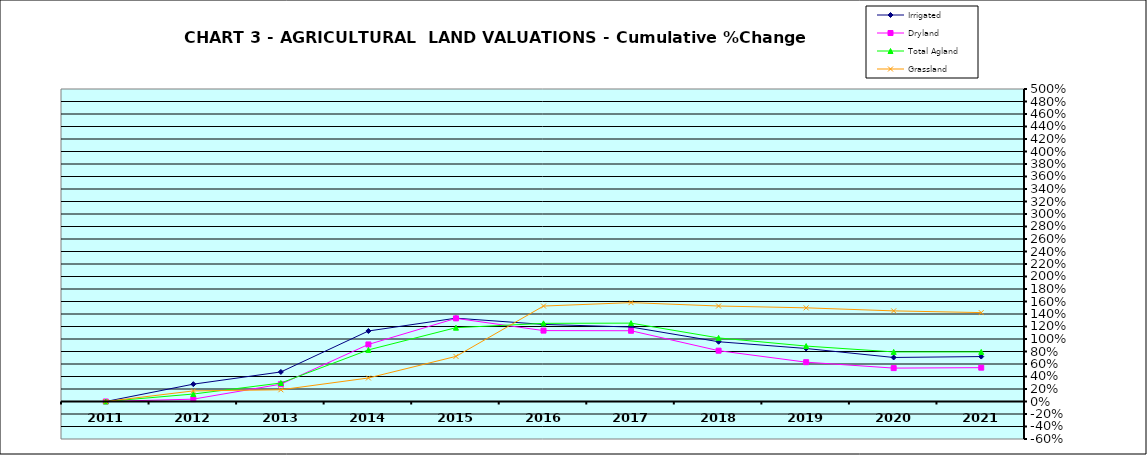
| Category | Irrigated | Dryland | Total Agland | Grassland |
|---|---|---|---|---|
| 2011.0 | 0 | 0 | 0 | 0 |
| 2012.0 | 0.277 | 0.038 | 0.12 | 0.17 |
| 2013.0 | 0.473 | 0.277 | 0.296 | 0.188 |
| 2014.0 | 1.128 | 0.913 | 0.826 | 0.376 |
| 2015.0 | 1.333 | 1.33 | 1.181 | 0.722 |
| 2016.0 | 1.233 | 1.134 | 1.25 | 1.527 |
| 2017.0 | 1.192 | 1.132 | 1.254 | 1.582 |
| 2018.0 | 0.956 | 0.813 | 1.017 | 1.528 |
| 2019.0 | 0.848 | 0.629 | 0.887 | 1.499 |
| 2020.0 | 0.704 | 0.534 | 0.793 | 1.45 |
| 2021.0 | 0.719 | 0.541 | 0.794 | 1.422 |